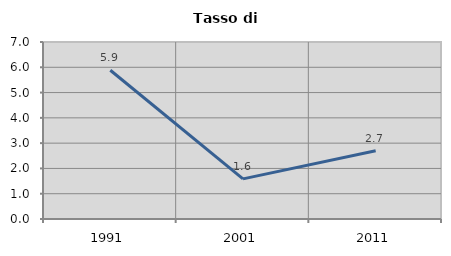
| Category | Tasso di disoccupazione   |
|---|---|
| 1991.0 | 5.882 |
| 2001.0 | 1.587 |
| 2011.0 | 2.703 |